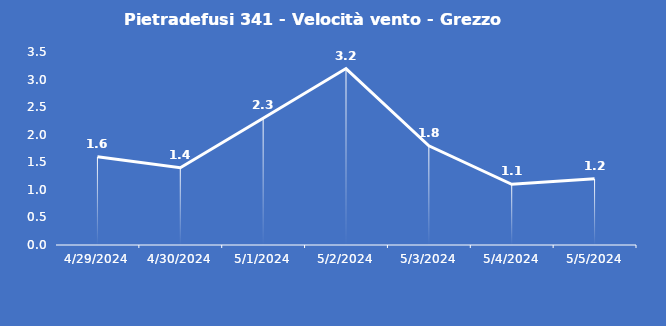
| Category | Pietradefusi 341 - Velocità vento - Grezzo (m/s) |
|---|---|
| 4/29/24 | 1.6 |
| 4/30/24 | 1.4 |
| 5/1/24 | 2.3 |
| 5/2/24 | 3.2 |
| 5/3/24 | 1.8 |
| 5/4/24 | 1.1 |
| 5/5/24 | 1.2 |